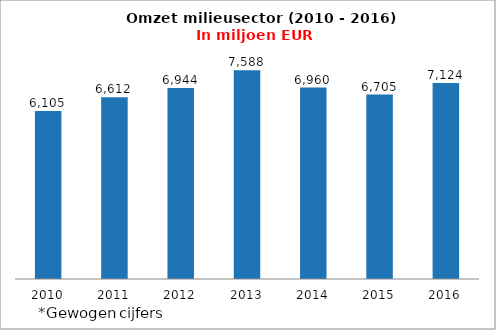
| Category | Omzet |
|---|---|
| 2010 | 6105.003 |
| 2011 | 6611.831 |
| 2012 | 6943.643 |
| 2013 | 7587.721 |
| 2014 | 6960.338 |
| 2015 | 6705.293 |
| 2016 | 7124.017 |